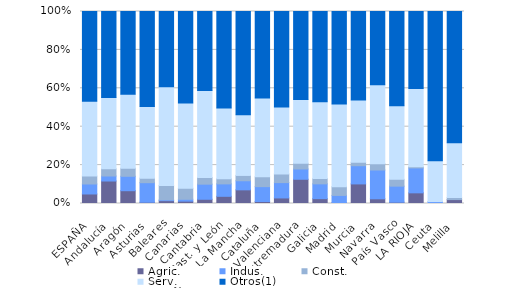
| Category | Agric. | Indus. | Const. | Serv. | Otros(1) |
|---|---|---|---|---|---|
| ESPAÑA | 4.96 | 5.2 | 4.12 | 38.93 | 46.79 |
| Andalucía | 11.71 | 2.61 | 3.75 | 37.2 | 44.74 |
| Aragón | 6.66 | 7.52 | 4.19 | 38.47 | 43.16 |
| Asturias | 0.67 | 10.17 | 2.33 | 37.33 | 49.5 |
| Baleares | 1.46 | 0.45 | 7.46 | 51.41 | 39.13 |
| Canarias | 1.22 | 0.97 | 5.73 | 44.41 | 47.71 |
| Cantabria | 2.21 | 7.89 | 3.47 | 45.43 | 41.32 |
| Cast. y León | 3.74 | 6.47 | 2.65 | 36.87 | 50.27 |
| Cast.-La Mancha | 7.11 | 4.74 | 2.77 | 31.62 | 53.76 |
| Cataluña | 1.04 | 7.75 | 5.09 | 41.03 | 45.06 |
| C. Valenciana | 2.89 | 7.99 | 4.5 | 34.85 | 49.75 |
| Extremadura | 12.61 | 5.35 | 2.96 | 33.24 | 45.75 |
| Galicia | 2.52 | 7.71 | 2.73 | 39.97 | 47.05 |
| Madrid | 0.38 | 3.83 | 4.52 | 43.12 | 48.17 |
| Murcia | 10.21 | 9.49 | 1.79 | 32.5 | 46.11 |
| Navarra | 2.45 | 14.99 | 3.27 | 41.14 | 38.15 |
| País Vasco | 0.69 | 8.35 | 3.54 | 38.31 | 49.12 |
| LA RIOJA | 5.52 | 12.88 | 0.61 | 40.49 | 39.88 |
| Ceuta | 0 | 1.01 | 0 | 21.21 | 77.78 |
| Melilla | 2.04 | 0 | 1.02 | 28.57 | 68.37 |